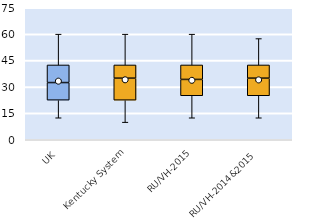
| Category | 25th | 50th | 75th |
|---|---|---|---|
| UK | 22.5 | 10 | 10 |
| Kentucky System | 22.5 | 12.5 | 7.5 |
| RU/VH-2015 | 25 | 9.286 | 8.214 |
| RU/VH-2014&2015 | 25 | 10 | 7.5 |